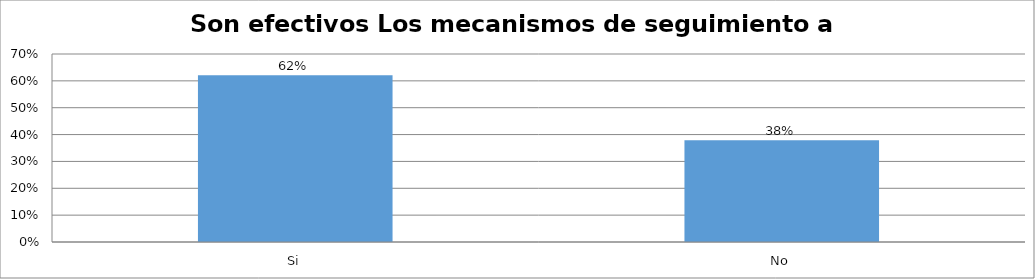
| Category | Series 0 |
|---|---|
| Si | 0.621 |
| No | 0.379 |